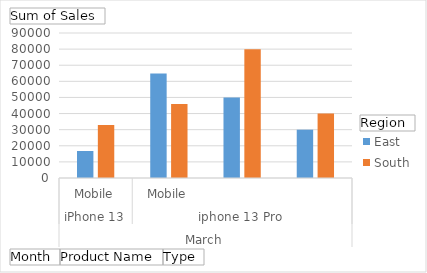
| Category | East | South |
|---|---|---|
| 0 | 16776 | 32853 |
| 1 | 64935 | 45954 |
| 2 | 49975 | 79960 |
| 3 | 29988 | 39984 |